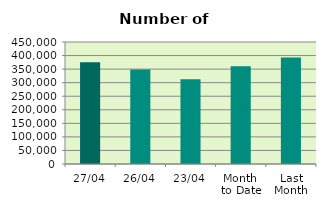
| Category | Series 0 |
|---|---|
| 27/04 | 374954 |
| 26/04 | 349020 |
| 23/04 | 312784 |
| Month 
to Date | 360418.625 |
| Last
Month | 392496.174 |